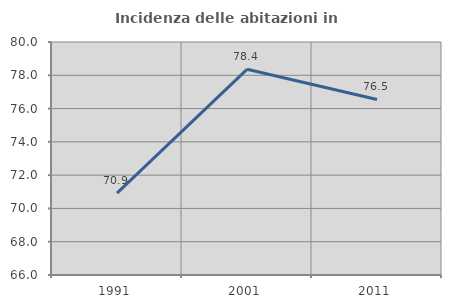
| Category | Incidenza delle abitazioni in proprietà  |
|---|---|
| 1991.0 | 70.92 |
| 2001.0 | 78.358 |
| 2011.0 | 76.547 |